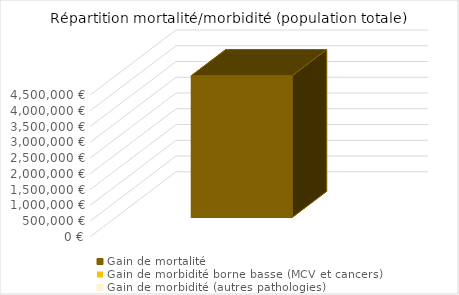
| Category | Gain de mortalité | Gain de morbidité borne basse (MCV et cancers) | Gain de morbidité (autres pathologies) |
|---|---|---|---|
| 0 | 8609659.592 | 153177.452 | 377271.785 |